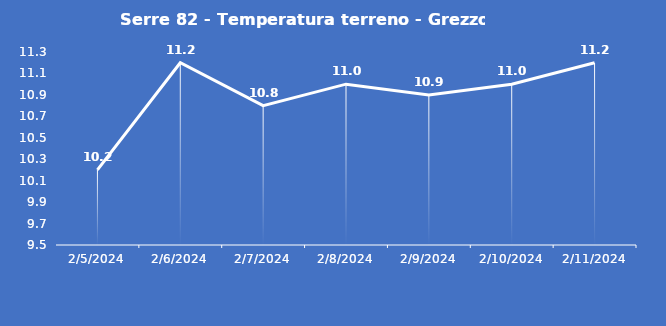
| Category | Serre 82 - Temperatura terreno - Grezzo (°C) |
|---|---|
| 2/5/24 | 10.2 |
| 2/6/24 | 11.2 |
| 2/7/24 | 10.8 |
| 2/8/24 | 11 |
| 2/9/24 | 10.9 |
| 2/10/24 | 11 |
| 2/11/24 | 11.2 |